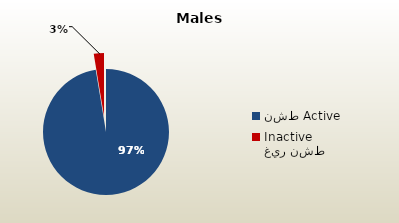
| Category | الذكور غير القطريين  Non-Qatari Males |
|---|---|
| نشط Active | 1677691 |
| غير نشط Inactive | 45013 |